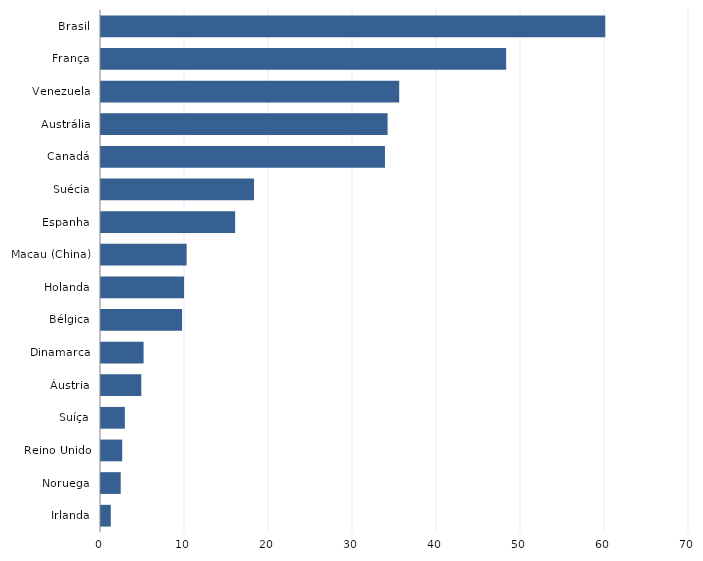
| Category | Series 0 |
|---|---|
| Irlanda | 1.164 |
| Noruega | 2.347 |
| Reino Unido | 2.525 |
| Suíça | 2.84 |
| Áustria | 4.799 |
| Dinamarca | 5.07 |
| Bélgica | 9.653 |
| Holanda | 9.889 |
| Macau (China) | 10.194 |
| Espanha | 15.97 |
| Suécia | 18.22 |
| Canadá | 33.805 |
| Austrália | 34.121 |
| Venezuela | 35.501 |
| França | 48.235 |
| Brasil | 60.035 |